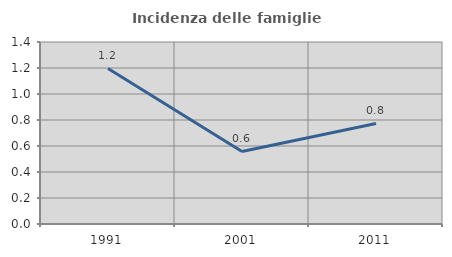
| Category | Incidenza delle famiglie numerose |
|---|---|
| 1991.0 | 1.197 |
| 2001.0 | 0.558 |
| 2011.0 | 0.773 |